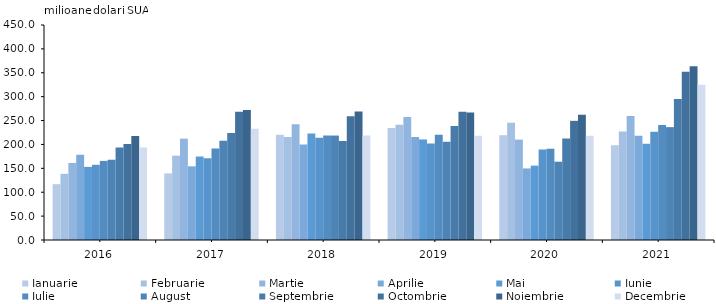
| Category | Ianuarie | Februarie | Martie | Aprilie | Mai | Iunie | Iulie | August | Septembrie | Octombrie | Noiembrie | Decembrie |
|---|---|---|---|---|---|---|---|---|---|---|---|---|
| 2016.0 | 116.8 | 138.5 | 161.3 | 178.5 | 153 | 157.4 | 165.6 | 168 | 193.6 | 200.8 | 217.6 | 193.5 |
| 2017.0 | 139.5 | 176.6 | 212.1 | 154.2 | 174.7 | 171.1 | 191.6 | 207.9 | 223.9 | 268.2 | 272.1 | 233.1 |
| 2018.0 | 220.3 | 215.5 | 242.1 | 199.7 | 223 | 214.1 | 218.8 | 218.6 | 207.3 | 259 | 268.9 | 218.8 |
| 2019.0 | 234.3 | 241.4 | 257.2 | 215.6 | 210.5 | 202.2 | 220.2 | 205.8 | 238.8 | 268.3 | 266.6 | 218.3 |
| 2020.0 | 219.5 | 245.3 | 210.2 | 149.8 | 155.7 | 189.6 | 191.1 | 163.9 | 212.3 | 249.4 | 262 | 218.3 |
| 2021.0 | 198.4 | 227 | 259.3 | 218.2 | 201.7 | 226.8 | 240.7 | 236.2 | 294.9 | 352.2 | 363.9 | 325 |